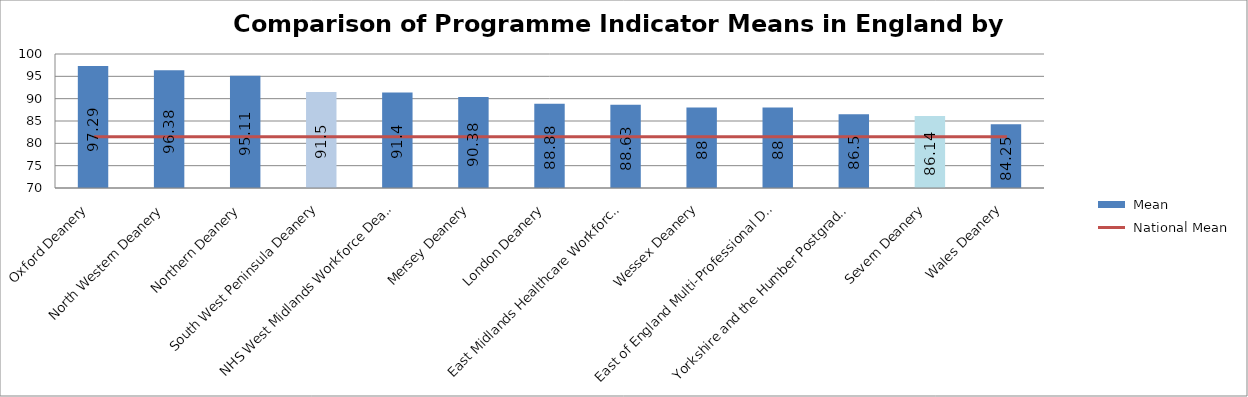
| Category |  Mean |
|---|---|
| Oxford Deanery | 97.29 |
| North Western Deanery | 96.38 |
| Northern Deanery | 95.11 |
| South West Peninsula Deanery | 91.5 |
| NHS West Midlands Workforce Deanery | 91.4 |
| Mersey Deanery | 90.38 |
| London Deanery | 88.88 |
| East Midlands Healthcare Workforce Deanery | 88.63 |
| Wessex Deanery | 88 |
| East of England Multi-Professional Deanery | 88 |
| Yorkshire and the Humber Postgraduate Deanery | 86.5 |
| Severn Deanery | 86.14 |
| Wales Deanery | 84.25 |